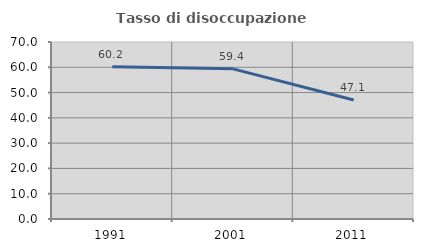
| Category | Tasso di disoccupazione giovanile  |
|---|---|
| 1991.0 | 60.194 |
| 2001.0 | 59.375 |
| 2011.0 | 47.059 |